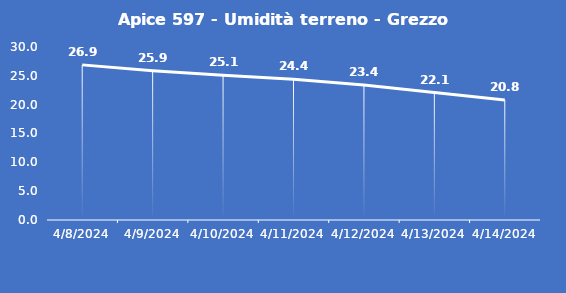
| Category | Apice 597 - Umidità terreno - Grezzo (%VWC) |
|---|---|
| 4/8/24 | 26.9 |
| 4/9/24 | 25.9 |
| 4/10/24 | 25.1 |
| 4/11/24 | 24.4 |
| 4/12/24 | 23.4 |
| 4/13/24 | 22.1 |
| 4/14/24 | 20.8 |